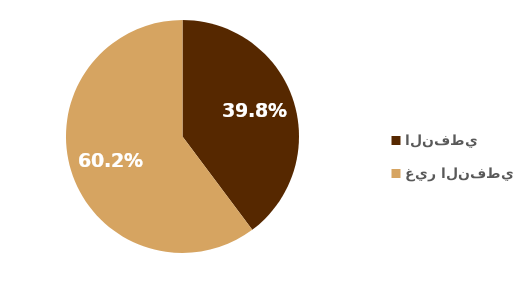
| Category | الربع الأول 2019 |
|---|---|
| النفطي | 39.78 |
| غير النفطي | 60.22 |